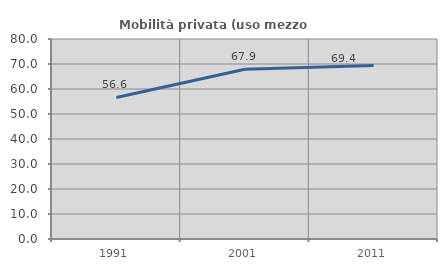
| Category | Mobilità privata (uso mezzo privato) |
|---|---|
| 1991.0 | 56.604 |
| 2001.0 | 67.904 |
| 2011.0 | 69.444 |